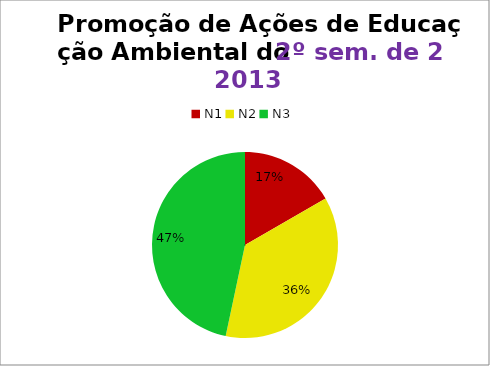
| Category | 2º/13 |
|---|---|
| N1 | 5 |
| N2 | 11 |
| N3 | 14 |